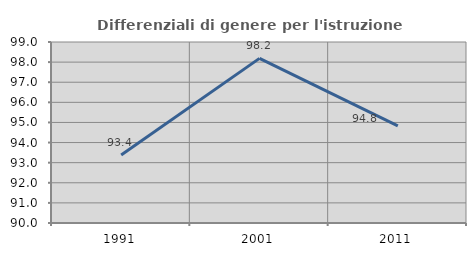
| Category | Differenziali di genere per l'istruzione superiore |
|---|---|
| 1991.0 | 93.385 |
| 2001.0 | 98.186 |
| 2011.0 | 94.825 |